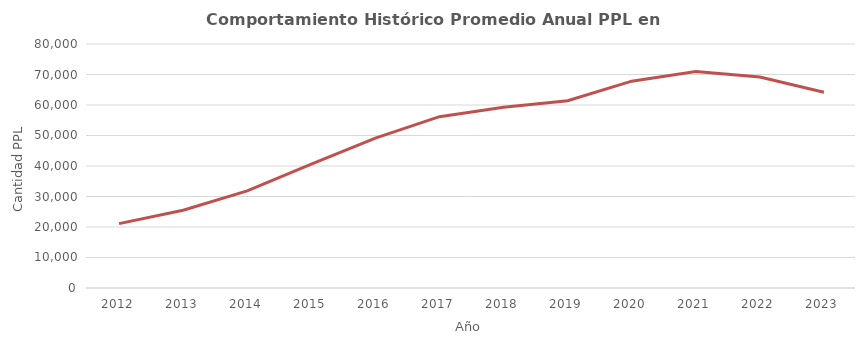
| Category | Promedio anual Domiciliaria |
|---|---|
| 2012.0 | 21098.25 |
| 2013.0 | 25499.083 |
| 2014.0 | 31836.75 |
| 2015.0 | 40614.5 |
| 2016.0 | 49161.167 |
| 2017.0 | 56180.75 |
| 2018.0 | 59289.25 |
| 2019.0 | 61380.5 |
| 2020.0 | 67811 |
| 2021.0 | 70980.5 |
| 2022.0 | 69173.833 |
| 2023.0 | 64185.2 |